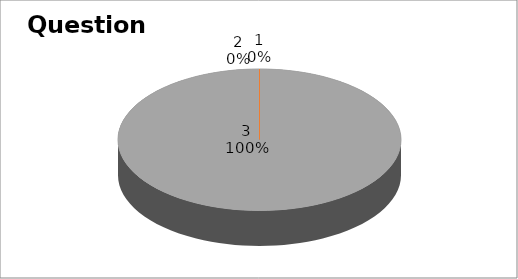
| Category | Series 0 |
|---|---|
| 0 | 0 |
| 1 | 0 |
| 2 | 8 |